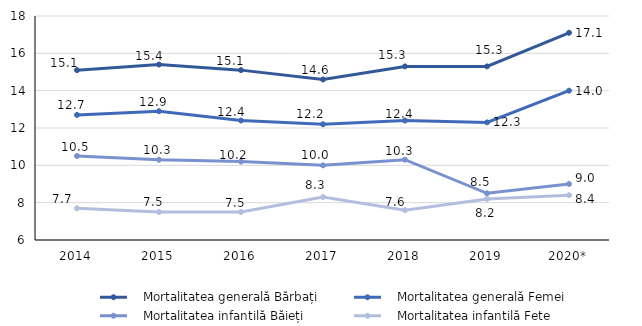
| Category | Series 0 | Series 1 | Series 2 | Series 3 |
|---|---|---|---|---|
| 2014 | 15.1 | 12.7 | 10.5 | 7.7 |
| 2015 | 15.4 | 12.9 | 10.3 | 7.5 |
| 2016 | 15.1 | 12.4 | 10.2 | 7.5 |
| 2017 | 14.6 | 12.2 | 10 | 8.3 |
| 2018 | 15.3 | 12.4 | 10.3 | 7.6 |
| 2019 | 15.3 | 12.3 | 8.5 | 8.2 |
| 2020* | 17.1 | 14 | 9 | 8.4 |